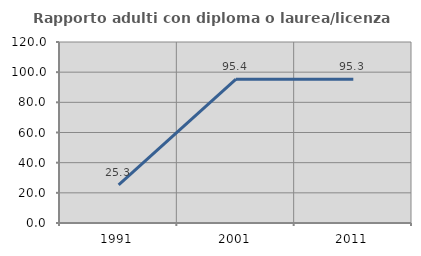
| Category | Rapporto adulti con diploma o laurea/licenza media  |
|---|---|
| 1991.0 | 25.333 |
| 2001.0 | 95.385 |
| 2011.0 | 95.294 |